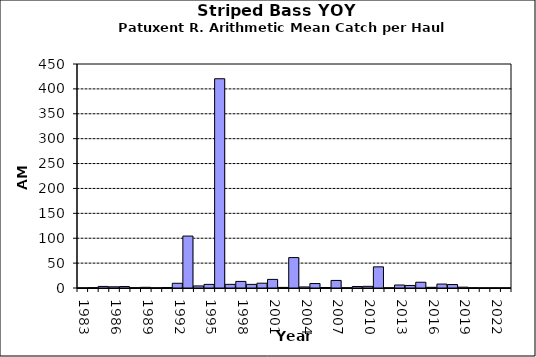
| Category | Series 0 |
|---|---|
| 1983.0 | 0.056 |
| 1984.0 | 0.611 |
| 1985.0 | 3.167 |
| 1986.0 | 2.444 |
| 1987.0 | 2.941 |
| 1988.0 | 0.588 |
| 1989.0 | 1.389 |
| 1990.0 | 0.278 |
| 1991.0 | 0.944 |
| 1992.0 | 9.5 |
| 1993.0 | 104.333 |
| 1994.0 | 4.167 |
| 1995.0 | 7.278 |
| 1996.0 | 420.389 |
| 1997.0 | 7.333 |
| 1998.0 | 13.222 |
| 1999.0 | 7.278 |
| 2000.0 | 9.667 |
| 2001.0 | 17.278 |
| 2002.0 | 1.222 |
| 2003.0 | 61.11 |
| 2004.0 | 2.11 |
| 2005.0 | 8.944 |
| 2006.0 | 1 |
| 2007.0 | 15.222 |
| 2008.0 | 0.33 |
| 2009.0 | 3 |
| 2010.0 | 3.33 |
| 2011.0 | 42.5 |
| 2012.0 | 0.056 |
| 2013.0 | 6 |
| 2014.0 | 5.11 |
| 2015.0 | 11.56 |
| 2016.0 | 1.39 |
| 2017.0 | 7.89 |
| 2018.0 | 6.94 |
| 2019.0 | 1.67 |
| 2020.0 | 0.5 |
| 2021.0 | 0.167 |
| 2022.0 | 0.222 |
| 2023.0 | 0.167 |